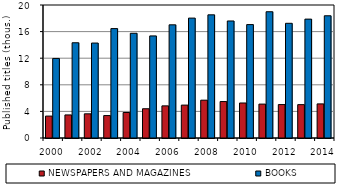
| Category | NEWSPAPERS AND MAGAZINES | BOOKS |
|---|---|---|
| 2000.0 | 3.295 | 11.965 |
| 2001.0 | 3.469 | 14.321 |
| 2002.0 | 3.636 | 14.278 |
| 2003.0 | 3.372 | 16.451 |
| 2004.0 | 3.835 | 15.749 |
| 2005.0 | 4.399 | 15.35 |
| 2006.0 | 4.832 | 17.019 |
| 2007.0 | 4.947 | 18.029 |
| 2008.0 | 5.687 | 18.52 |
| 2009.0 | 5.481 | 17.598 |
| 2010.0 | 5.265 | 17.054 |
| 2011.0 | 5.098 | 18.985 |
| 2012.0 | 5.028 | 17.247 |
| 2013.0 | 5.017 | 17.876 |
| 2014.0 | 5.127 | 18.379 |